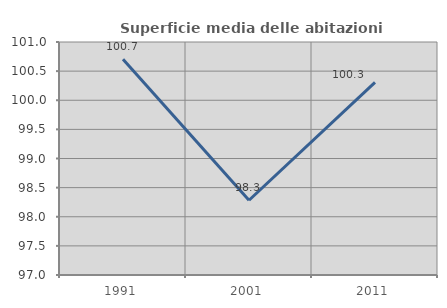
| Category | Superficie media delle abitazioni occupate |
|---|---|
| 1991.0 | 100.704 |
| 2001.0 | 98.283 |
| 2011.0 | 100.306 |